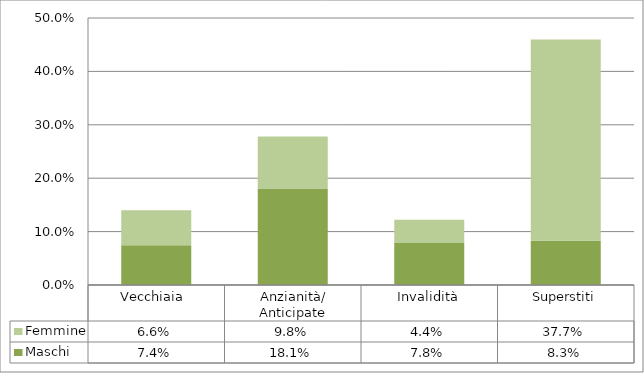
| Category | Maschi | Femmine |
|---|---|---|
| Vecchiaia  | 0.074 | 0.066 |
| Anzianità/ Anticipate | 0.181 | 0.098 |
| Invalidità | 0.078 | 0.044 |
| Superstiti | 0.083 | 0.377 |